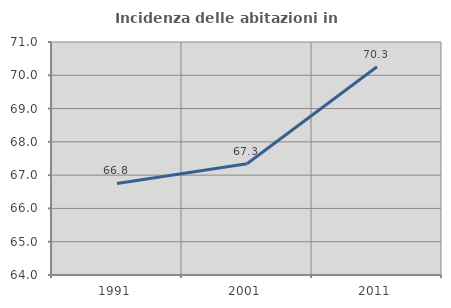
| Category | Incidenza delle abitazioni in proprietà  |
|---|---|
| 1991.0 | 66.752 |
| 2001.0 | 67.342 |
| 2011.0 | 70.257 |